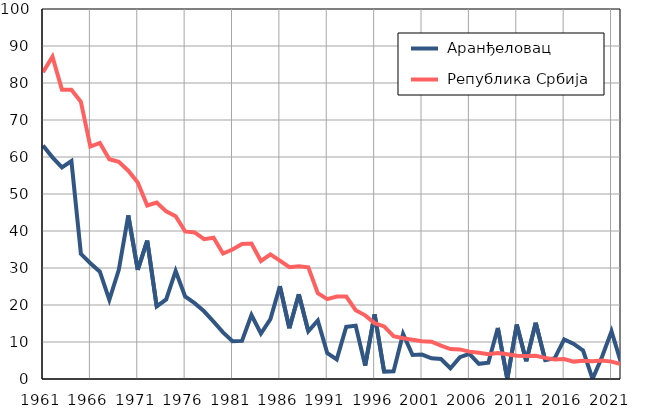
| Category |  Аранђеловац |  Република Србија |
|---|---|---|
| 1961.0 | 63.1 | 82.9 |
| 1962.0 | 59.9 | 87.1 |
| 1963.0 | 57.2 | 78.2 |
| 1964.0 | 58.9 | 78.2 |
| 1965.0 | 33.8 | 74.9 |
| 1966.0 | 31.3 | 62.8 |
| 1967.0 | 29 | 63.8 |
| 1968.0 | 21.4 | 59.4 |
| 1969.0 | 29.5 | 58.7 |
| 1970.0 | 44.2 | 56.3 |
| 1971.0 | 29.5 | 53.1 |
| 1972.0 | 37.4 | 46.9 |
| 1973.0 | 19.6 | 47.7 |
| 1974.0 | 21.5 | 45.3 |
| 1975.0 | 29.2 | 44 |
| 1976.0 | 22.3 | 39.9 |
| 1977.0 | 20.5 | 39.6 |
| 1978.0 | 18.3 | 37.8 |
| 1979.0 | 15.5 | 38.2 |
| 1980.0 | 12.6 | 33.9 |
| 1981.0 | 10.2 | 35 |
| 1982.0 | 10.3 | 36.5 |
| 1983.0 | 17.3 | 36.6 |
| 1984.0 | 12.3 | 31.9 |
| 1985.0 | 16.2 | 33.7 |
| 1986.0 | 25.1 | 32 |
| 1987.0 | 13.7 | 30.2 |
| 1988.0 | 22.9 | 30.5 |
| 1989.0 | 12.9 | 30.2 |
| 1990.0 | 15.8 | 23.2 |
| 1991.0 | 7 | 21.6 |
| 1992.0 | 5.3 | 22.3 |
| 1993.0 | 14.1 | 22.3 |
| 1994.0 | 14.4 | 18.6 |
| 1995.0 | 3.6 | 17.2 |
| 1996.0 | 17.5 | 15.1 |
| 1997.0 | 2 | 14.2 |
| 1998.0 | 2.1 | 11.6 |
| 1999.0 | 12.2 | 11 |
| 2000.0 | 6.5 | 10.6 |
| 2001.0 | 6.6 | 10.2 |
| 2002.0 | 5.6 | 10.1 |
| 2003.0 | 5.4 | 9 |
| 2004.0 | 2.9 | 8.1 |
| 2005.0 | 5.9 | 8 |
| 2006.0 | 6.8 | 7.4 |
| 2007.0 | 4.1 | 7.1 |
| 2008.0 | 4.4 | 6.7 |
| 2009.0 | 13.8 | 7 |
| 2010.0 | 0 | 6.7 |
| 2011.0 | 14.7 | 6.3 |
| 2012.0 | 4.8 | 6.2 |
| 2013.0 | 15.2 | 6.3 |
| 2014.0 | 5.1 | 5.7 |
| 2015.0 | 5.6 | 5.3 |
| 2016.0 | 10.7 | 5.4 |
| 2017.0 | 9.5 | 4.7 |
| 2018.0 | 7.7 | 4.9 |
| 2019.0 | 0 | 4.8 |
| 2020.0 | 6 | 5 |
| 2021.0 | 12.9 | 4.7 |
| 2022.0 | 4.4 | 4 |